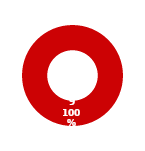
| Category | TVM |
|---|---|
| MIL 2 Complete | 0 |
| MIL 2 Not Complete | 9 |